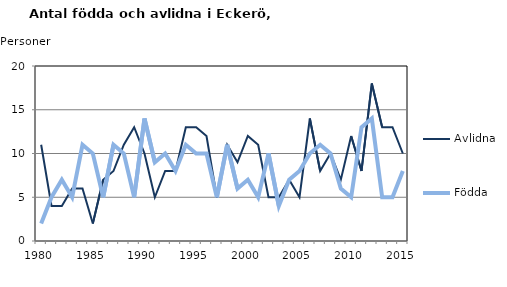
| Category | Avlidna | Födda |
|---|---|---|
| 1980.0 | 11 | 2 |
| 1981.0 | 4 | 5 |
| 1982.0 | 4 | 7 |
| 1983.0 | 6 | 5 |
| 1984.0 | 6 | 11 |
| 1985.0 | 2 | 10 |
| 1986.0 | 7 | 5 |
| 1987.0 | 8 | 11 |
| 1988.0 | 11 | 10 |
| 1989.0 | 13 | 5 |
| 1990.0 | 10 | 14 |
| 1991.0 | 5 | 9 |
| 1992.0 | 8 | 10 |
| 1993.0 | 8 | 8 |
| 1994.0 | 13 | 11 |
| 1995.0 | 13 | 10 |
| 1996.0 | 12 | 10 |
| 1997.0 | 5 | 5 |
| 1998.0 | 11 | 11 |
| 1999.0 | 9 | 6 |
| 2000.0 | 12 | 7 |
| 2001.0 | 11 | 5 |
| 2002.0 | 5 | 10 |
| 2003.0 | 5 | 4 |
| 2004.0 | 7 | 7 |
| 2005.0 | 5 | 8 |
| 2006.0 | 14 | 10 |
| 2007.0 | 8 | 11 |
| 2008.0 | 10 | 10 |
| 2009.0 | 7 | 6 |
| 2010.0 | 12 | 5 |
| 2011.0 | 8 | 13 |
| 2012.0 | 18 | 14 |
| 2013.0 | 13 | 5 |
| 2014.0 | 13 | 5 |
| 2015.0 | 10 | 8 |